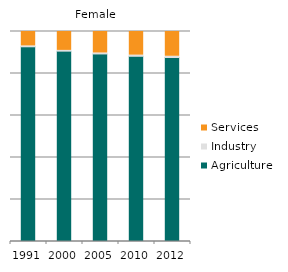
| Category | Agriculture | Industry | Services |
|---|---|---|---|
| 1991.0 | 92.718 | 0.419 | 6.862 |
| 2000.0 | 90.647 | 0.357 | 8.996 |
| 2005.0 | 89.309 | 0.466 | 10.225 |
| 2010.0 | 88.198 | 0.547 | 11.255 |
| 2012.0 | 87.621 | 0.588 | 11.791 |